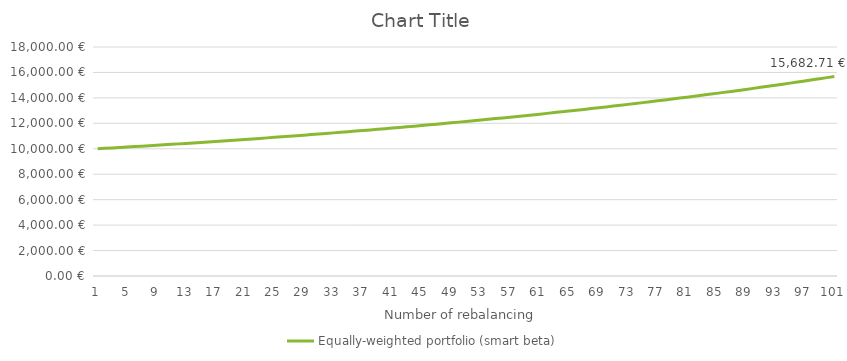
| Category | Equally-weighted portfolio (smart beta) |
|---|---|
| 0 | 10000 |
| 1 | 10033.333 |
| 2 | 10067 |
| 3 | 10101.003 |
| 4 | 10135.347 |
| 5 | 10170.034 |
| 6 | 10205.067 |
| 7 | 10240.451 |
| 8 | 10276.189 |
| 9 | 10312.284 |
| 10 | 10348.74 |
| 11 | 10385.561 |
| 12 | 10422.75 |
| 13 | 10460.311 |
| 14 | 10498.247 |
| 15 | 10536.563 |
| 16 | 10575.262 |
| 17 | 10614.348 |
| 18 | 10653.825 |
| 19 | 10693.697 |
| 20 | 10733.967 |
| 21 | 10774.64 |
| 22 | 10815.72 |
| 23 | 10857.21 |
| 24 | 10899.115 |
| 25 | 10941.44 |
| 26 | 10984.188 |
| 27 | 11027.363 |
| 28 | 11070.97 |
| 29 | 11115.013 |
| 30 | 11159.496 |
| 31 | 11204.425 |
| 32 | 11249.802 |
| 33 | 11295.634 |
| 34 | 11341.923 |
| 35 | 11388.676 |
| 36 | 11435.896 |
| 37 | 11483.588 |
| 38 | 11531.757 |
| 39 | 11580.408 |
| 40 | 11629.546 |
| 41 | 11679.175 |
| 42 | 11729.3 |
| 43 | 11779.926 |
| 44 | 11831.059 |
| 45 | 11882.702 |
| 46 | 11934.863 |
| 47 | 11987.545 |
| 48 | 12040.754 |
| 49 | 12094.494 |
| 50 | 12148.773 |
| 51 | 12203.594 |
| 52 | 12258.963 |
| 53 | 12314.886 |
| 54 | 12371.368 |
| 55 | 12428.415 |
| 56 | 12486.033 |
| 57 | 12544.226 |
| 58 | 12603.002 |
| 59 | 12662.365 |
| 60 | 12722.322 |
| 61 | 12782.879 |
| 62 | 12844.041 |
| 63 | 12905.815 |
| 64 | 12968.206 |
| 65 | 13031.222 |
| 66 | 13094.867 |
| 67 | 13159.149 |
| 68 | 13224.074 |
| 69 | 13289.648 |
| 70 | 13355.878 |
| 71 | 13422.77 |
| 72 | 13490.331 |
| 73 | 13558.568 |
| 74 | 13627.487 |
| 75 | 13697.095 |
| 76 | 13767.399 |
| 77 | 13838.407 |
| 78 | 13910.124 |
| 79 | 13982.558 |
| 80 | 14055.717 |
| 81 | 14129.608 |
| 82 | 14204.237 |
| 83 | 14279.613 |
| 84 | 14355.742 |
| 85 | 14432.633 |
| 86 | 14510.293 |
| 87 | 14588.729 |
| 88 | 14667.95 |
| 89 | 14747.963 |
| 90 | 14828.776 |
| 91 | 14910.397 |
| 92 | 14992.834 |
| 93 | 15076.096 |
| 94 | 15160.19 |
| 95 | 15245.125 |
| 96 | 15330.91 |
| 97 | 15417.552 |
| 98 | 15505.061 |
| 99 | 15593.445 |
| 100 | 15682.713 |